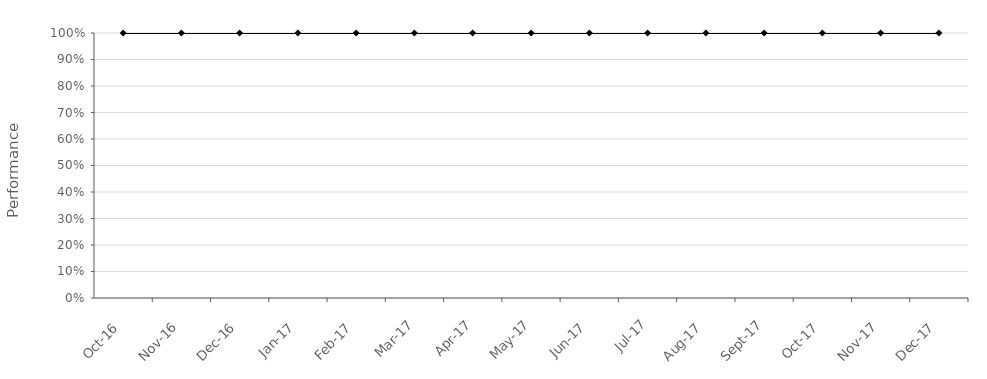
| Category | NPS SL001 |
|---|---|
| 2016-10-01 | 1 |
| 2016-11-01 | 1 |
| 2016-12-01 | 1 |
| 2017-01-01 | 1 |
| 2017-02-01 | 1 |
| 2017-03-01 | 1 |
| 2017-04-01 | 1 |
| 2017-05-01 | 1 |
| 2017-06-01 | 1 |
| 2017-07-01 | 1 |
| 2017-08-01 | 1 |
| 2017-09-01 | 1 |
| 2017-10-01 | 1 |
| 2017-11-01 | 1 |
| 2017-12-01 | 1 |